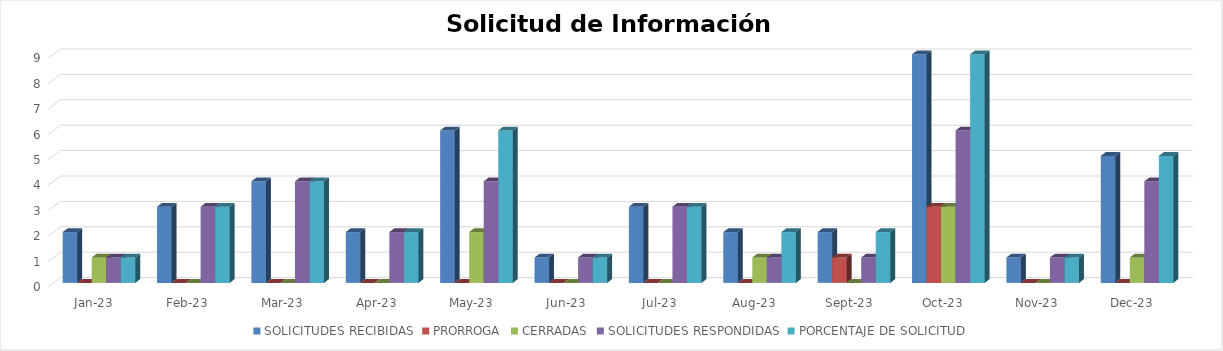
| Category | SOLICITUDES RECIBIDAS | PRORROGA | CERRADAS | SOLICITUDES RESPONDIDAS | PORCENTAJE DE SOLICITUD |
|---|---|---|---|---|---|
| 2023-01-01 | 2 | 0 | 1 | 1 | 1 |
| 2023-02-01 | 3 | 0 | 0 | 3 | 3 |
| 2023-03-01 | 4 | 0 | 0 | 4 | 4 |
| 2023-04-01 | 2 | 0 | 0 | 2 | 2 |
| 2023-05-01 | 6 | 0 | 2 | 4 | 6 |
| 2023-06-01 | 1 | 0 | 0 | 1 | 1 |
| 2023-07-01 | 3 | 0 | 0 | 3 | 3 |
| 2023-08-01 | 2 | 0 | 1 | 1 | 2 |
| 2023-09-01 | 2 | 1 | 0 | 1 | 2 |
| 2023-10-01 | 9 | 3 | 3 | 6 | 9 |
| 2023-11-01 | 1 | 0 | 0 | 1 | 1 |
| 2023-12-01 | 5 | 0 | 1 | 4 | 5 |